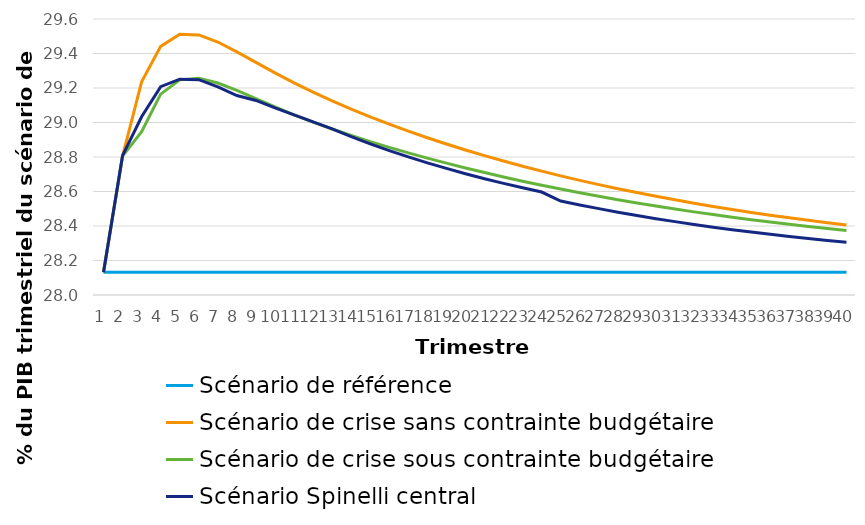
| Category | Scénario de référence | Scénario de crise sans contrainte budgétaire | Scénario de crise sous contrainte budgétaire | Scénario Spinelli central |
|---|---|---|---|---|
| 0 | 28.132 | 28.132 | 28.132 | 28.132 |
| 1 | 28.132 | 28.805 | 28.805 | 28.809 |
| 2 | 28.132 | 29.235 | 28.946 | 29.033 |
| 3 | 28.132 | 29.441 | 29.164 | 29.208 |
| 4 | 28.132 | 29.512 | 29.247 | 29.251 |
| 5 | 28.132 | 29.508 | 29.256 | 29.248 |
| 6 | 28.132 | 29.466 | 29.229 | 29.207 |
| 7 | 28.132 | 29.41 | 29.186 | 29.156 |
| 8 | 28.132 | 29.348 | 29.138 | 29.128 |
| 9 | 28.132 | 29.288 | 29.09 | 29.085 |
| 10 | 28.132 | 29.23 | 29.045 | 29.045 |
| 11 | 28.132 | 29.176 | 29.002 | 29.003 |
| 12 | 28.132 | 29.125 | 28.962 | 28.964 |
| 13 | 28.132 | 29.077 | 28.925 | 28.918 |
| 14 | 28.132 | 29.032 | 28.889 | 28.876 |
| 15 | 28.132 | 28.99 | 28.856 | 28.837 |
| 16 | 28.132 | 28.95 | 28.824 | 28.8 |
| 17 | 28.132 | 28.912 | 28.793 | 28.766 |
| 18 | 28.132 | 28.875 | 28.764 | 28.734 |
| 19 | 28.132 | 28.841 | 28.736 | 28.703 |
| 20 | 28.132 | 28.808 | 28.71 | 28.674 |
| 21 | 28.132 | 28.776 | 28.684 | 28.647 |
| 22 | 28.132 | 28.746 | 28.66 | 28.621 |
| 23 | 28.132 | 28.718 | 28.636 | 28.597 |
| 24 | 28.132 | 28.691 | 28.614 | 28.544 |
| 25 | 28.132 | 28.665 | 28.593 | 28.522 |
| 26 | 28.132 | 28.64 | 28.572 | 28.501 |
| 27 | 28.132 | 28.616 | 28.552 | 28.48 |
| 28 | 28.132 | 28.594 | 28.534 | 28.461 |
| 29 | 28.132 | 28.572 | 28.516 | 28.443 |
| 30 | 28.132 | 28.552 | 28.498 | 28.425 |
| 31 | 28.132 | 28.532 | 28.482 | 28.409 |
| 32 | 28.132 | 28.514 | 28.466 | 28.393 |
| 33 | 28.132 | 28.496 | 28.451 | 28.379 |
| 34 | 28.132 | 28.479 | 28.437 | 28.365 |
| 35 | 28.132 | 28.463 | 28.423 | 28.352 |
| 36 | 28.132 | 28.447 | 28.41 | 28.339 |
| 37 | 28.132 | 28.433 | 28.397 | 28.328 |
| 38 | 28.132 | 28.419 | 28.385 | 28.317 |
| 39 | 28.132 | 28.405 | 28.374 | 28.306 |